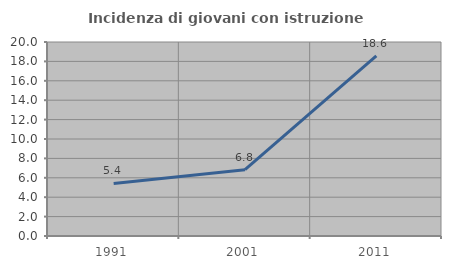
| Category | Incidenza di giovani con istruzione universitaria |
|---|---|
| 1991.0 | 5.422 |
| 2001.0 | 6.838 |
| 2011.0 | 18.56 |